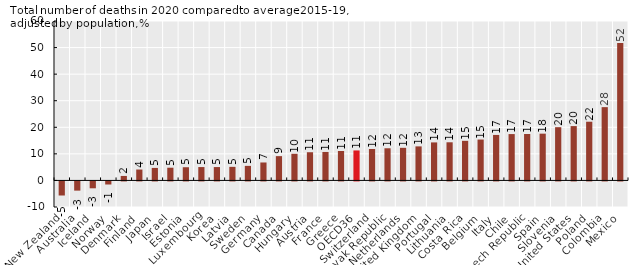
| Category | Series 0 |
|---|---|
| New Zealand | -5.295 |
| Australia | -3.463 |
| Iceland | -2.584 |
| Norway | -1.155 |
| Denmark | 1.69 |
| Finland | 4.106 |
| Japan | 4.703 |
| Israel | 4.784 |
| Estonia | 4.969 |
| Luxembourg | 5.031 |
| Korea | 5.031 |
| Latvia | 5.11 |
| Sweden | 5.477 |
| Germany | 6.758 |
| Canada | 9.143 |
| Hungary | 10.029 |
| Austria | 10.612 |
| France | 10.714 |
| Greece | 11.074 |
| OECD36 | 11.285 |
| Switzerland | 11.836 |
| Slovak Republic | 12.104 |
| Netherlands | 12.27 |
| United Kingdom | 12.812 |
| Portugal | 14.308 |
| Lithuania | 14.355 |
| Costa Rica | 14.902 |
| Belgium | 15.388 |
| Italy | 17.118 |
| Chile | 17.444 |
| Czech Republic | 17.483 |
| Spain | 17.601 |
| Slovenia | 20.039 |
| United States | 20.45 |
| Poland | 22.096 |
| Colombia | 27.582 |
| Mexico | 51.751 |